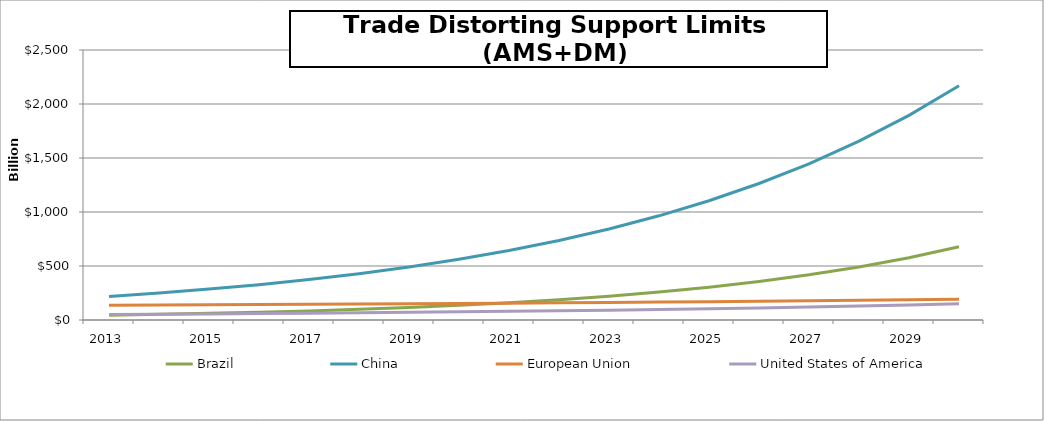
| Category | Brazil | China | European Union | United States of America |
|---|---|---|---|---|
| 2013.0 | 44792417150 | 218381903100 | 135721475795.588 | 50208429000 |
| 2014.0 | 52453906958.958 | 249958669302.958 | 137852625940.174 | 52945805618.222 |
| 2015.0 | 61453090677.038 | 286101254146.023 | 140093628839.066 | 55924056847.952 |
| 2016.0 | 72023529274.642 | 327469848724.142 | 142450146987.54 | 59164378376.361 |
| 2017.0 | 84439563400.185 | 374820103964.591 | 144928134761.154 | 62689830998.577 |
| 2018.0 | 99023433500.105 | 429016933569.279 | 147533853461.075 | 66525504737.285 |
| 2019.0 | 116153643109.774 | 491050312783.048 | 150273887134.936 | 70698697403.981 |
| 2020.0 | 136274782372.583 | 562053361572.944 | 153155159213.199 | 75239108872.666 |
| 2021.0 | 159909066742.624 | 643323042531.114 | 156184950003.061 | 80179052448.597 |
| 2022.0 | 187669890341.536 | 736343851575.343 | 159370915084.107 | 85553684836.365 |
| 2023.0 | 220277745727.536 | 842814934188.506 | 162721104652.18 | 91401256343.938 |
| 2024.0 | 258578923251.533 | 964681122510.186 | 166243983860.368 | 97763383103.345 |
| 2025.0 | 303567475315.42 | 1104168460213.082 | 169948454208.479 | 104685343245.316 |
| 2026.0 | 356411015583.522 | 1263824864072.07 | 173843876035.076 | 112216399135.739 |
| 2027.0 | 418481022728.918 | 1446566664962.111 | 177940092168.878 | 120410147967.197 |
| 2028.0 | 491388435205.123 | 1655731878416.562 | 182247452799.313 | 129324903200.707 |
| 2029.0 | 577025460854.635 | 1895141177801.605 | 186776841629.048 | 139024109572.313 |
| 2030.0 | 677614686463.054 | 2169167683860.746 | 191539703374.583 | 149576794618.04 |